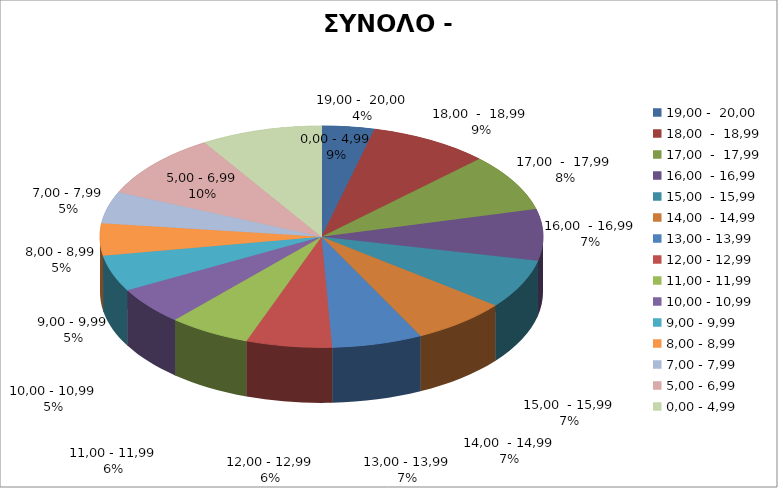
| Category | ΣΥΝΟΛΟ - 2010 |
|---|---|
| 19,00 -  20,00 | 3.834 |
| 18,00  -  18,99 | 8.764 |
| 17,00  -  17,99 | 8.383 |
| 16,00  - 16,99 | 7.492 |
| 15,00  - 15,99 | 7.183 |
| 14,00  - 14,99 | 6.98 |
| 13,00 - 13,99 | 6.597 |
| 12,00 - 12,99 | 6.251 |
| 11,00 - 11,99 | 6.003 |
| 10,00 - 10,99 | 5.479 |
| 9,00 - 9,99 | 5.269 |
| 8,00 - 8,99 | 4.694 |
| 7,00 - 7,99 | 4.648 |
| 5,00 - 6,99 | 9.579 |
| 0,00 - 4,99 | 8.845 |